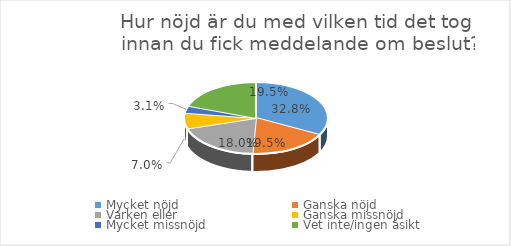
| Category | Series 0 |
|---|---|
| Mycket nöjd  | 0.328 |
| Ganska nöjd | 0.18 |
| Varken eller  | 0.195 |
| Ganska missnöjd | 0.07 |
| Mycket missnöjd  | 0.031 |
| Vet inte/ingen åsikt | 0.195 |